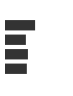
| Category | Series 0 |
|---|---|
| 0 | 0.455 |
| 1 | 0.31 |
| 2 | 0.343 |
| 3 | 0.325 |